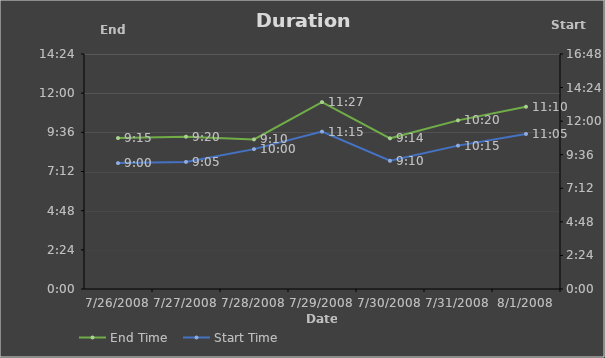
| Category | End Time |
|---|---|
| 7/26/08 | 0.385 |
| 7/27/08 | 0.389 |
| 7/28/08 | 0.382 |
| 7/29/08 | 0.477 |
| 7/30/08 | 0.385 |
| 7/31/08 | 0.431 |
| 8/1/08 | 0.465 |